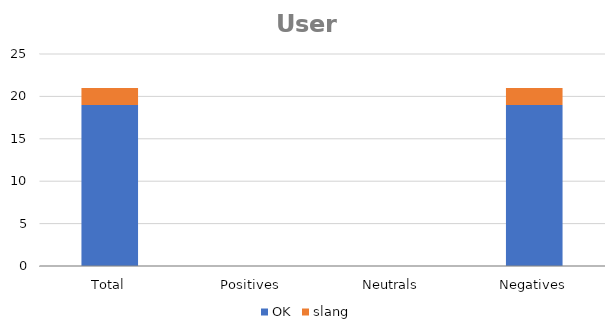
| Category | OK | slang |
|---|---|---|
| Total | 19 | 2 |
| Positives | 0 | 0 |
| Neutrals | 0 | 0 |
| Negatives | 19 | 2 |